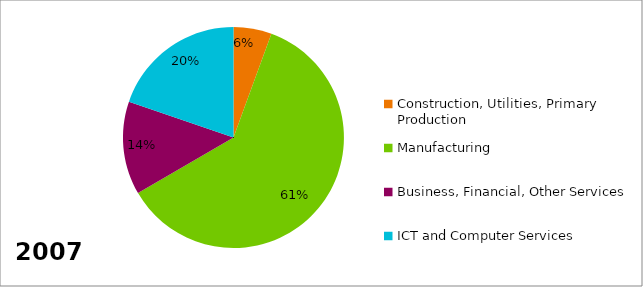
| Category | Series 0 |
|---|---|
| Construction, Utilities, Primary Production | 0.056 |
| Manufacturing | 0.61 |
| Business, Financial, Other Services | 0.137 |
| ICT and Computer Services | 0.197 |